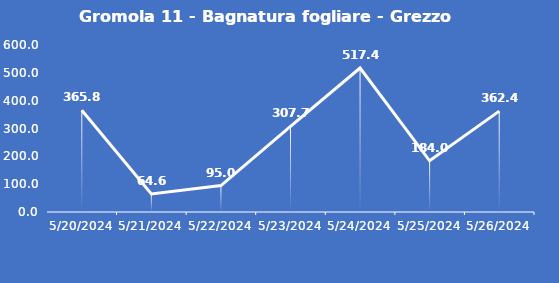
| Category | Gromola 11 - Bagnatura fogliare - Grezzo (min) |
|---|---|
| 5/20/24 | 365.8 |
| 5/21/24 | 64.6 |
| 5/22/24 | 95 |
| 5/23/24 | 307.7 |
| 5/24/24 | 517.4 |
| 5/25/24 | 184 |
| 5/26/24 | 362.4 |